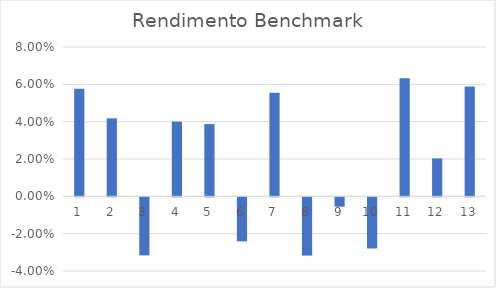
| Category | Series 0 |
|---|---|
| 1.0 | 0.058 |
| 2.0 | 0.042 |
| 3.0 | -0.031 |
| 4.0 | 0.04 |
| 5.0 | 0.039 |
| 6.0 | -0.024 |
| 7.0 | 0.056 |
| 8.0 | -0.031 |
| 9.0 | -0.005 |
| 10.0 | -0.027 |
| 11.0 | 0.063 |
| 12.0 | 0.02 |
| 13.0 | 0.059 |